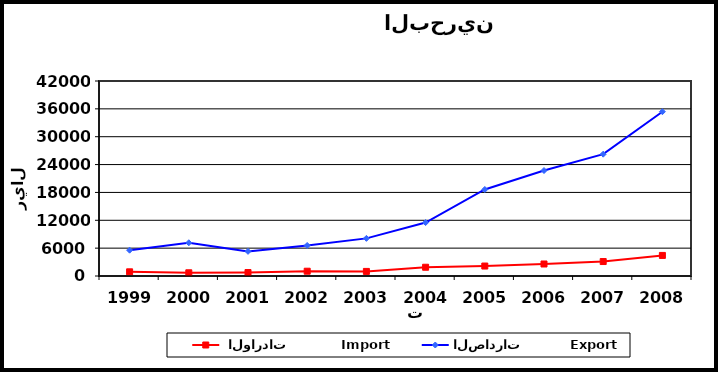
| Category |  الواردات           Import | الصادرات          Export |
|---|---|---|
| 1999.0 | 901 | 5560 |
| 2000.0 | 691 | 7158 |
| 2001.0 | 746 | 5304 |
| 2002.0 | 1032 | 6577 |
| 2003.0 | 988 | 8105 |
| 2004.0 | 1885 | 11507 |
| 2005.0 | 2146 | 18637 |
| 2006.0 | 2585 | 22717 |
| 2007.0 | 3116 | 26238 |
| 2008.0 | 4429 | 35389 |